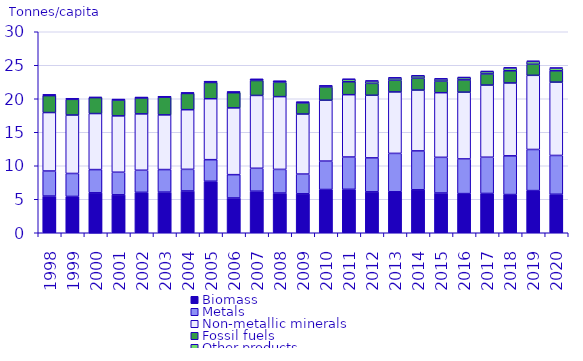
| Category | Biomass | Metals | Non-metallic minerals | Fossil fuels | Other products | Waste imported or exported |
|---|---|---|---|---|---|---|
| 1998.0 | 5.474 | 3.742 | 8.726 | 2.52 | 0.122 | 0 |
| 1999.0 | 5.42 | 3.429 | 8.722 | 2.341 | 0.088 | 0 |
| 2000.0 | 5.961 | 3.466 | 8.366 | 2.374 | 0.099 | 0 |
| 2001.0 | 5.663 | 3.37 | 8.413 | 2.377 | 0.062 | 0 |
| 2002.0 | 6.033 | 3.296 | 8.412 | 2.386 | 0.059 | 0 |
| 2003.0 | 6.065 | 3.368 | 8.159 | 2.656 | 0.053 | 0 |
| 2004.0 | 6.24 | 3.224 | 8.9 | 2.428 | 0.078 | 0 |
| 2005.0 | 7.684 | 3.224 | 9.095 | 2.423 | 0.123 | 0.002 |
| 2006.0 | 5.19 | 3.483 | 9.965 | 2.264 | 0.111 | 0.001 |
| 2007.0 | 6.204 | 3.419 | 10.873 | 2.228 | 0.178 | 0.001 |
| 2008.0 | 5.927 | 3.531 | 10.86 | 2.134 | 0.167 | 0.003 |
| 2009.0 | 5.813 | 2.947 | 8.961 | 1.656 | 0.11 | 0.017 |
| 2010.0 | 6.457 | 4.238 | 9.087 | 1.971 | 0.168 | 0.031 |
| 2011.0 | 6.481 | 4.824 | 9.303 | 1.931 | 0.358 | 0.049 |
| 2012.0 | 6.107 | 5.069 | 9.347 | 1.778 | 0.343 | 0.056 |
| 2013.0 | 6.115 | 5.73 | 9.173 | 1.747 | 0.347 | 0.058 |
| 2014.0 | 6.413 | 5.804 | 9.078 | 1.773 | 0.362 | 0.069 |
| 2015.0 | 5.935 | 5.324 | 9.644 | 1.733 | 0.325 | 0.068 |
| 2016.0 | 5.842 | 5.178 | 9.965 | 1.831 | 0.341 | 0.072 |
| 2017.0 | 5.865 | 5.409 | 10.768 | 1.662 | 0.349 | 0.075 |
| 2018.0 | 5.703 | 5.778 | 10.874 | 1.824 | 0.421 | 0.072 |
| 2019.0 | 6.294 | 6.138 | 11.064 | 1.651 | 0.424 | 0.075 |
| 2020.0 | 5.745 | 5.793 | 10.941 | 1.691 | 0.382 | 0.096 |